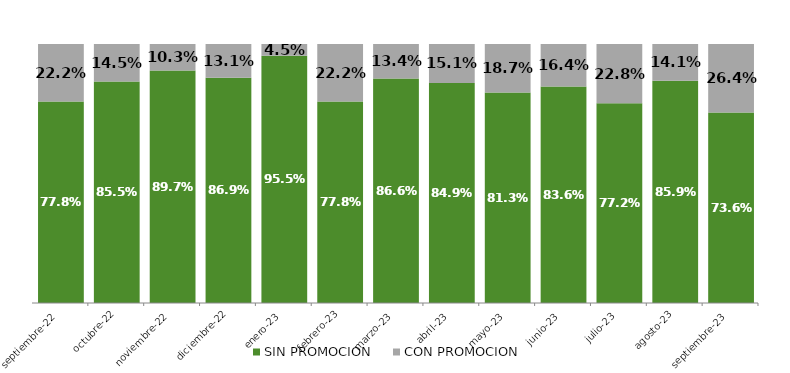
| Category | SIN PROMOCION   | CON PROMOCION   |
|---|---|---|
| 2022-09-01 | 0.778 | 0.222 |
| 2022-10-01 | 0.855 | 0.145 |
| 2022-11-01 | 0.897 | 0.103 |
| 2022-12-01 | 0.869 | 0.131 |
| 2023-01-01 | 0.955 | 0.045 |
| 2023-02-01 | 0.778 | 0.222 |
| 2023-03-01 | 0.866 | 0.134 |
| 2023-04-01 | 0.849 | 0.151 |
| 2023-05-01 | 0.813 | 0.187 |
| 2023-06-01 | 0.836 | 0.164 |
| 2023-07-01 | 0.772 | 0.228 |
| 2023-08-01 | 0.859 | 0.141 |
| 2023-09-01 | 0.736 | 0.264 |